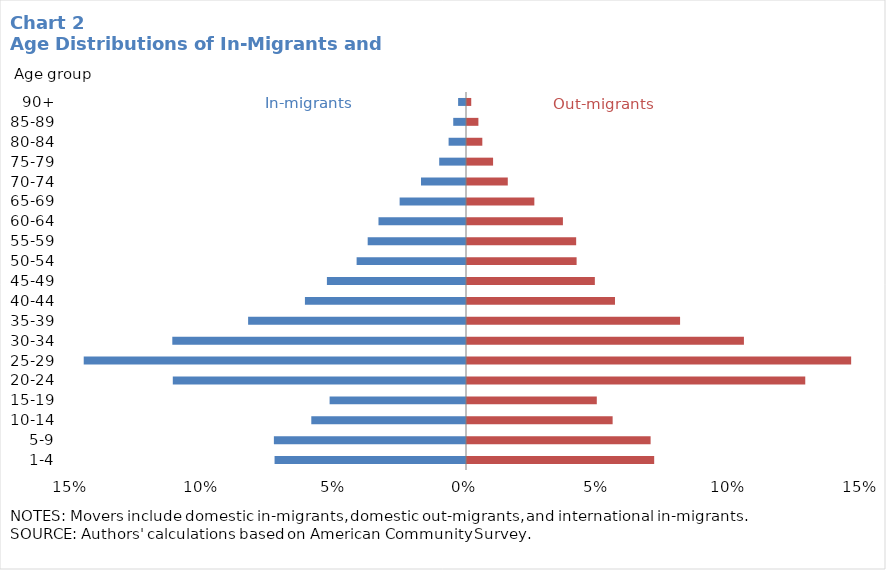
| Category | In-Migrants | Out-Migrants |
|---|---|---|
| 1-4 | -0.073 | 0.071 |
| 5-9 | -0.073 | 0.07 |
| 10-14 | -0.059 | 0.056 |
| 15-19 | -0.052 | 0.05 |
| 20-24 | -0.111 | 0.129 |
| 25-29 | -0.145 | 0.146 |
| 30-34 | -0.112 | 0.106 |
| 35-39 | -0.083 | 0.081 |
| 40-44 | -0.061 | 0.057 |
| 45-49 | -0.053 | 0.049 |
| 50-54 | -0.042 | 0.042 |
| 55-59 | -0.037 | 0.042 |
| 60-64 | -0.033 | 0.037 |
| 65-69 | -0.025 | 0.026 |
| 70-74 | -0.017 | 0.016 |
| 75-79 | -0.01 | 0.01 |
| 80-84 | -0.007 | 0.006 |
| 85-89 | -0.005 | 0.005 |
| 90+ | -0.003 | 0.002 |